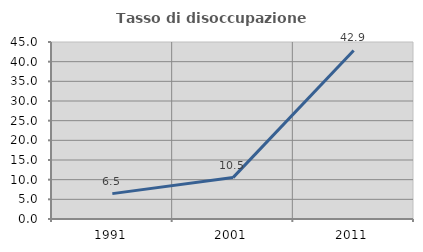
| Category | Tasso di disoccupazione giovanile  |
|---|---|
| 1991.0 | 6.452 |
| 2001.0 | 10.526 |
| 2011.0 | 42.857 |